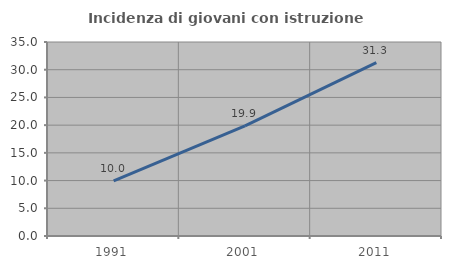
| Category | Incidenza di giovani con istruzione universitaria |
|---|---|
| 1991.0 | 9.961 |
| 2001.0 | 19.859 |
| 2011.0 | 31.267 |